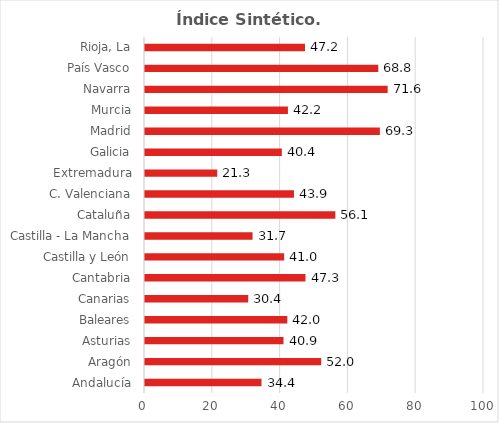
| Category | Índice Sintético |
|---|---|
| Andalucía | 34.366 |
| Aragón | 51.976 |
| Asturias | 40.856 |
| Baleares | 41.981 |
| Canarias | 30.447 |
| Cantabria | 47.346 |
| Castilla y León | 41.048 |
| Castilla - La Mancha | 31.726 |
| Cataluña | 56.144 |
| C. Valenciana | 43.943 |
| Extremadura | 21.308 |
| Galicia | 40.373 |
| Madrid | 69.286 |
| Murcia | 42.16 |
| Navarra | 71.583 |
| País Vasco | 68.813 |
| Rioja, La | 47.199 |